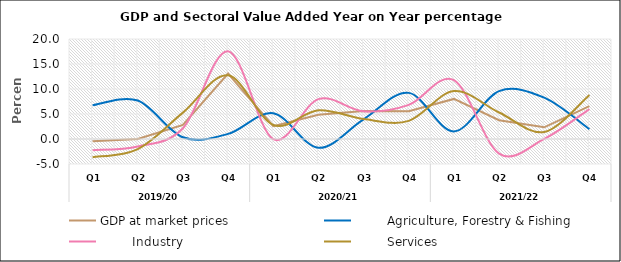
| Category | GDP at market prices |         Agriculture, Forestry & Fishing |         Industry |         Services |
|---|---|---|---|---|
| 0 | -0.457 | 6.741 | -2.232 | -3.641 |
| 1 | 0.02 | 7.693 | -1.482 | -2.012 |
| 2 | 2.817 | 0.34 | 2.153 | 5.274 |
| 3 | 13.079 | 1.02 | 17.538 | 12.733 |
| 4 | 2.564 | 5.151 | -0.041 | 2.808 |
| 5 | 4.833 | -1.763 | 7.973 | 5.748 |
| 6 | 5.587 | 3.941 | 5.54 | 3.989 |
| 7 | 5.554 | 9.225 | 6.83 | 3.624 |
| 8 | 8.016 | 1.523 | 11.766 | 9.581 |
| 9 | 3.75 | 9.587 | -2.921 | 5.306 |
| 10 | 2.338 | 8.26 | 0.022 | 1.4 |
| 11 | 6.578 | 1.976 | 5.99 | 8.806 |